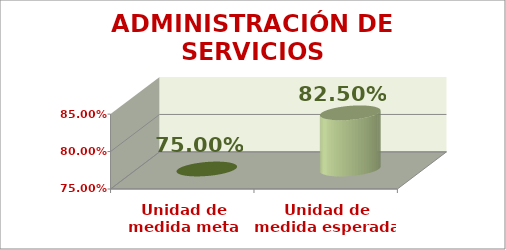
| Category | ADMINISTRACIÓN DE SERVICIOS COMPLEMENTARIOS |
|---|---|
| Unidad de medida meta base | 0.75 |
| Unidad de medida esperada | 0.825 |